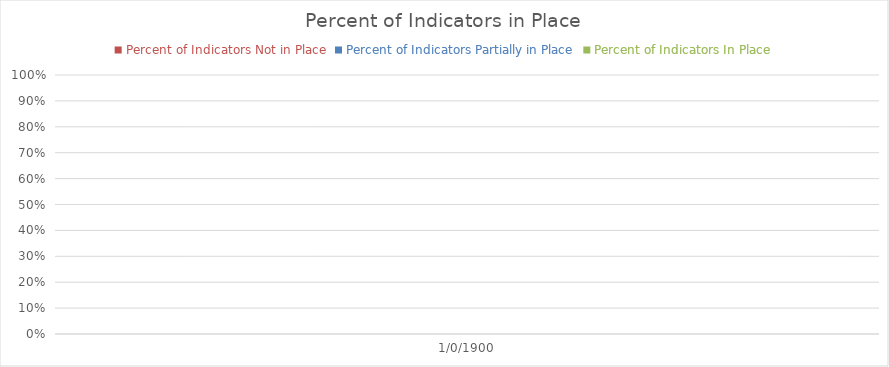
| Category | Percent of Indicators Not in Place | Percent of Indicators Partially in Place | Percent of Indicators In Place |
|---|---|---|---|
| 0.0 | 0 | 0 | 0 |
| 0.0 | 0 | 0 | 0 |
| 0.0 | 0 | 0 | 0 |
| 0.0 | 0 | 0 | 0 |
| 0.0 | 0 | 0 | 0 |
| 0.0 | 0 | 0 | 0 |